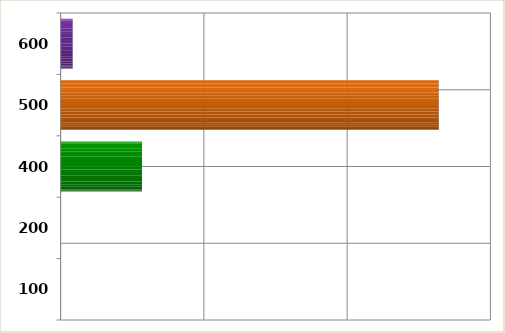
| Category | Series 0 |
|---|---|
| 100.0 | 0 |
| 200.0 | 0 |
| 400.0 | 11362390.7 |
| 500.0 | 52803545.76 |
| 600.0 | 1688057.8 |